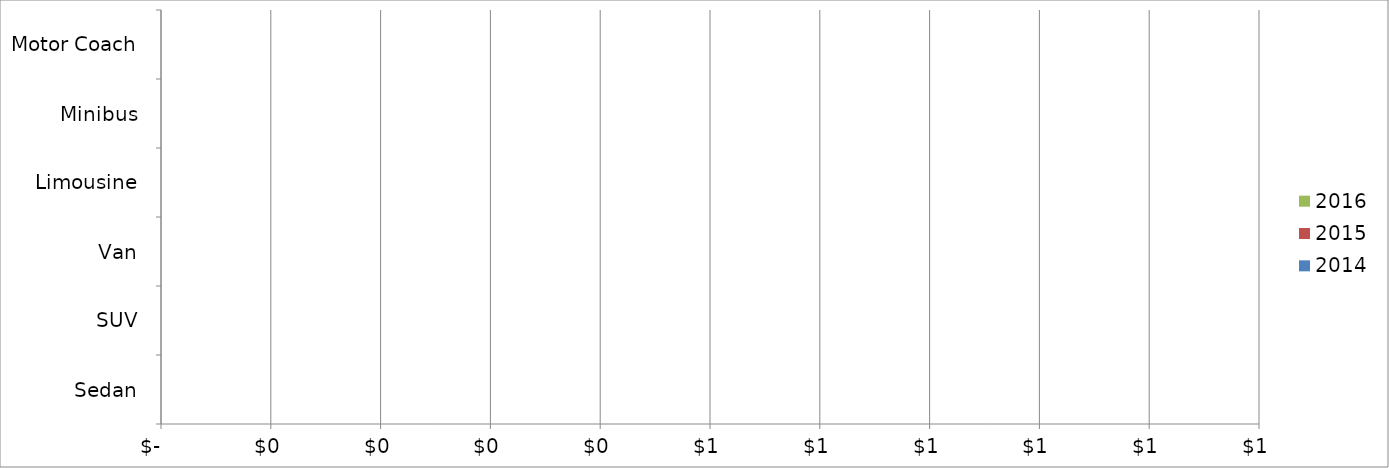
| Category | 2014 | 2015 | 2016 |
|---|---|---|---|
| Sedan | 0 | 0 | 0 |
| SUV | 0 | 0 | 0 |
| Van | 0 | 0 | 0 |
| Limousine | 0 | 0 | 0 |
| Minibus | 0 | 0 | 0 |
| Motor Coach | 0 | 0 | 0 |